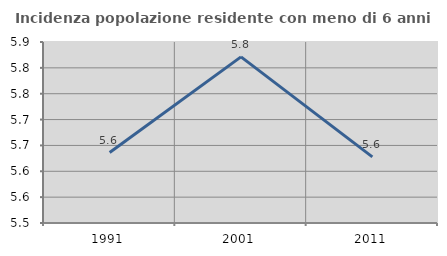
| Category | Incidenza popolazione residente con meno di 6 anni |
|---|---|
| 1991.0 | 5.636 |
| 2001.0 | 5.821 |
| 2011.0 | 5.628 |